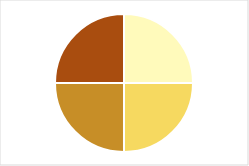
| Category | Series 0 |
|---|---|
| 0 | 0 |
| 1 | 0.25 |
| 2 | 0.25 |
| 3 | 0.25 |
| 4 | 0.25 |